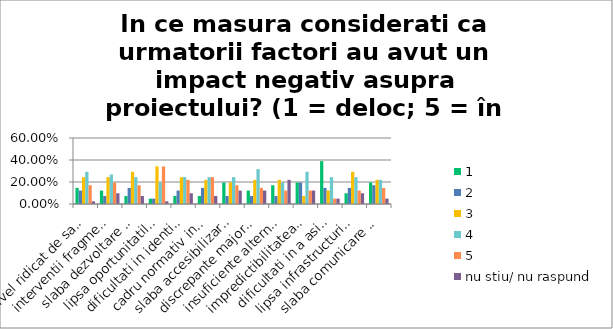
| Category | 1 | 2 | 3 | 4 | 5 | nu stiu/ nu raspund |
|---|---|---|---|---|---|---|
| nivel ridicat de saracie si excluziune sociala | 0.146 | 0.122 | 0.244 | 0.293 | 0.171 | 0.024 |
| interventii fragmentate implementate pe termen limitat | 0.122 | 0.073 | 0.244 | 0.268 | 0.195 | 0.098 |
| slaba dezvoltare a serviciilor comunitare de prevenire, consiliere si sprijin | 0.073 | 0.146 | 0.293 | 0.244 | 0.171 | 0.073 |
| lipsa oportunitatilor de angajare | 0.049 | 0.049 | 0.342 | 0.195 | 0.342 | 0.024 |
| dificultati in identificarea angajatorilor dispusi sa organizeze stagii de practica | 0.073 | 0.122 | 0.244 | 0.244 | 0.22 | 0.098 |
| cadru normativ instabil | 0.073 | 0.146 | 0.22 | 0.244 | 0.244 | 0.073 |
| slaba accesibilizare a institutiilor, spatiilor publice, mijloacelor de transport pentru persoanele cu dizabilitati | 0.195 | 0.073 | 0.195 | 0.244 | 0.171 | 0.122 |
| discrepante majore in ceea ce priveste nivelul de resurse intre rural si urban | 0.122 | 0.073 | 0.22 | 0.317 | 0.146 | 0.122 |
| insuficiente alternative de ingrijire a copiilor/ persoanelor dependente in afara mediului familial | 0.171 | 0.073 | 0.22 | 0.195 | 0.122 | 0.22 |
| impredictibilitatea platilor catre beneficiari si riscuri de sistare a interventiilor/faliment | 0.195 | 0.195 | 0.073 | 0.293 | 0.122 | 0.122 |
| dificultati in a asigura resurse umane pentru activitatile de consiliere/formare | 0.39 | 0.146 | 0.122 | 0.244 | 0.049 | 0.049 |
| lipsa infrastructurii, in special in comunitatile marginalizate | 0.098 | 0.146 | 0.293 | 0.244 | 0.122 | 0.098 |
| slaba comunicare intre institutii | 0.195 | 0.171 | 0.22 | 0.22 | 0.146 | 0.049 |